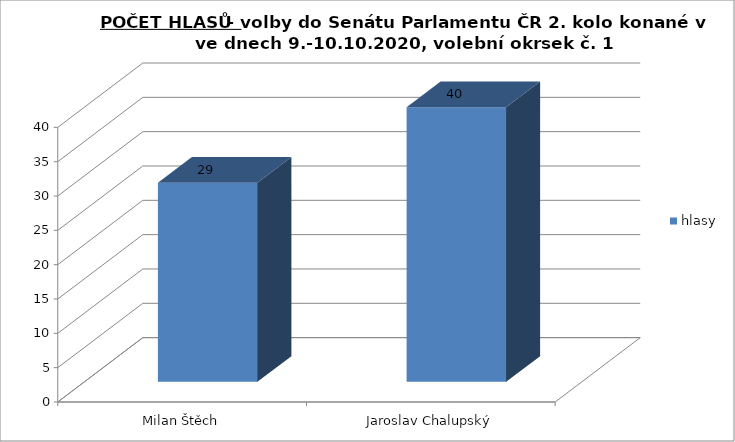
| Category | hlasy |
|---|---|
| Milan Štěch | 29 |
| Jaroslav Chalupský | 40 |